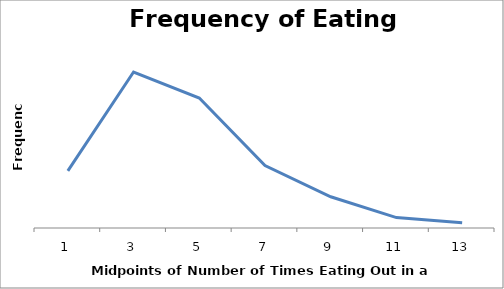
| Category | Total |
|---|---|
| 1 | 11 |
| 3 | 30 |
| 5 | 25 |
| 7 | 12 |
| 9 | 6 |
| 11 | 2 |
| 13 | 1 |